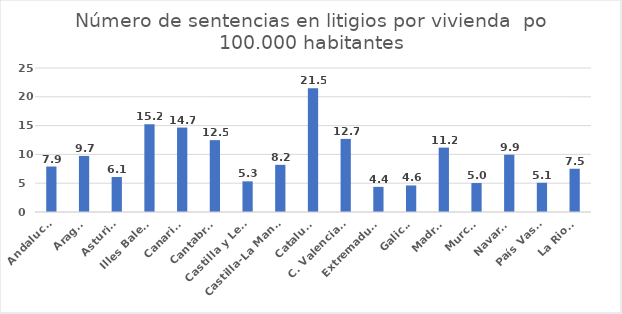
| Category | Número de sentencias en litigios por vivienda  por 100.000 habitantes |
|---|---|
| Andalucía | 7.897 |
| Aragón | 9.733 |
| Asturias | 6.073 |
| Illes Balears | 15.218 |
| Canarias | 14.657 |
| Cantabria | 12.474 |
| Castilla y León | 5.316 |
| Castilla-La Mancha | 8.186 |
| Cataluña | 21.495 |
| C. Valenciana | 12.689 |
| Extremadura | 4.363 |
| Galicia | 4.611 |
| Madrid | 11.18 |
| Murcia | 5.028 |
| Navarra | 9.946 |
| País Vasco | 5.074 |
| La Rioja | 7.512 |